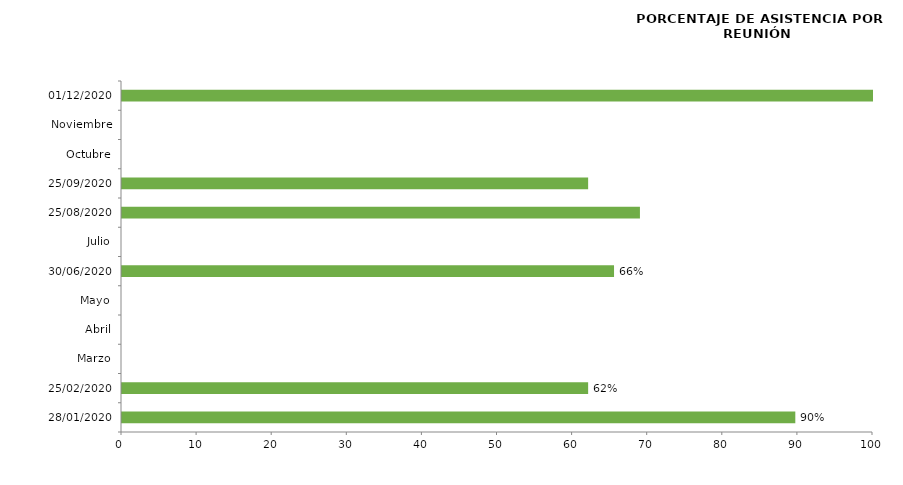
| Category | Series 0 |
|---|---|
| 28/01/2020 | 89.655 |
| 25/02/2020 | 62.069 |
| Marzo | 0 |
| Abril | 0 |
| Mayo | 0 |
| 30/06/2020 | 65.517 |
| Julio | 0 |
| 25/08/2020 | 68.966 |
| 25/09/2020 | 62.069 |
| Octubre | 0 |
| Noviembre | 0 |
| 01/12/2020 | 100 |